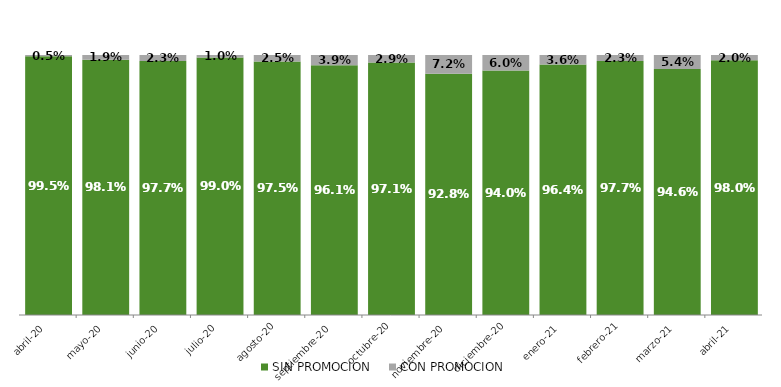
| Category | SIN PROMOCION   | CON PROMOCION   |
|---|---|---|
| 2020-04-01 | 0.995 | 0.005 |
| 2020-05-01 | 0.981 | 0.019 |
| 2020-06-01 | 0.977 | 0.023 |
| 2020-07-01 | 0.99 | 0.01 |
| 2020-08-01 | 0.975 | 0.025 |
| 2020-09-01 | 0.961 | 0.039 |
| 2020-10-01 | 0.971 | 0.029 |
| 2020-11-01 | 0.928 | 0.072 |
| 2020-12-01 | 0.94 | 0.06 |
| 2021-01-01 | 0.964 | 0.036 |
| 2021-02-01 | 0.977 | 0.023 |
| 2021-03-01 | 0.946 | 0.054 |
| 2021-04-01 | 0.98 | 0.02 |